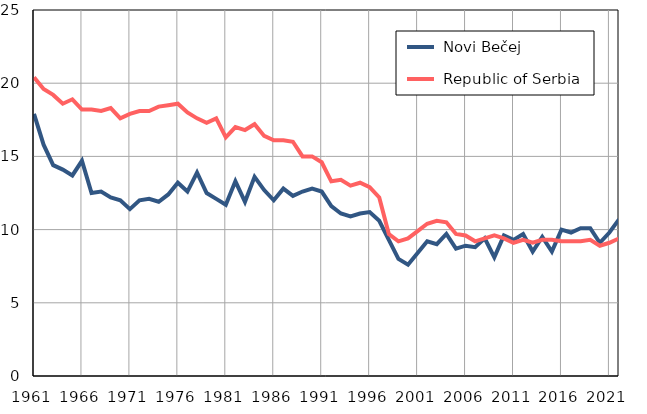
| Category |  Novi Bečej |  Republic of Serbia |
|---|---|---|
| 1961.0 | 17.9 | 20.4 |
| 1962.0 | 15.8 | 19.6 |
| 1963.0 | 14.4 | 19.2 |
| 1964.0 | 14.1 | 18.6 |
| 1965.0 | 13.7 | 18.9 |
| 1966.0 | 14.7 | 18.2 |
| 1967.0 | 12.5 | 18.2 |
| 1968.0 | 12.6 | 18.1 |
| 1969.0 | 12.2 | 18.3 |
| 1970.0 | 12 | 17.6 |
| 1971.0 | 11.4 | 17.9 |
| 1972.0 | 12 | 18.1 |
| 1973.0 | 12.1 | 18.1 |
| 1974.0 | 11.9 | 18.4 |
| 1975.0 | 12.4 | 18.5 |
| 1976.0 | 13.2 | 18.6 |
| 1977.0 | 12.6 | 18 |
| 1978.0 | 13.9 | 17.6 |
| 1979.0 | 12.5 | 17.3 |
| 1980.0 | 12.1 | 17.6 |
| 1981.0 | 11.7 | 16.3 |
| 1982.0 | 13.3 | 17 |
| 1983.0 | 11.9 | 16.8 |
| 1984.0 | 13.6 | 17.2 |
| 1985.0 | 12.7 | 16.4 |
| 1986.0 | 12 | 16.1 |
| 1987.0 | 12.8 | 16.1 |
| 1988.0 | 12.3 | 16 |
| 1989.0 | 12.6 | 15 |
| 1990.0 | 12.8 | 15 |
| 1991.0 | 12.6 | 14.6 |
| 1992.0 | 11.6 | 13.3 |
| 1993.0 | 11.1 | 13.4 |
| 1994.0 | 10.9 | 13 |
| 1995.0 | 11.1 | 13.2 |
| 1996.0 | 11.2 | 12.9 |
| 1997.0 | 10.6 | 12.2 |
| 1998.0 | 9.3 | 9.7 |
| 1999.0 | 8 | 9.2 |
| 2000.0 | 7.6 | 9.4 |
| 2001.0 | 8.4 | 9.9 |
| 2002.0 | 9.2 | 10.4 |
| 2003.0 | 9 | 10.6 |
| 2004.0 | 9.7 | 10.5 |
| 2005.0 | 8.7 | 9.7 |
| 2006.0 | 8.9 | 9.6 |
| 2007.0 | 8.8 | 9.2 |
| 2008.0 | 9.4 | 9.4 |
| 2009.0 | 8.1 | 9.6 |
| 2010.0 | 9.6 | 9.4 |
| 2011.0 | 9.3 | 9.1 |
| 2012.0 | 9.7 | 9.3 |
| 2013.0 | 8.5 | 9.1 |
| 2014.0 | 9.5 | 9.3 |
| 2015.0 | 8.5 | 9.3 |
| 2016.0 | 10 | 9.2 |
| 2017.0 | 9.8 | 9.2 |
| 2018.0 | 10.1 | 9.2 |
| 2019.0 | 10.1 | 9.3 |
| 2020.0 | 9.1 | 8.9 |
| 2021.0 | 9.8 | 9.1 |
| 2022.0 | 10.7 | 9.4 |